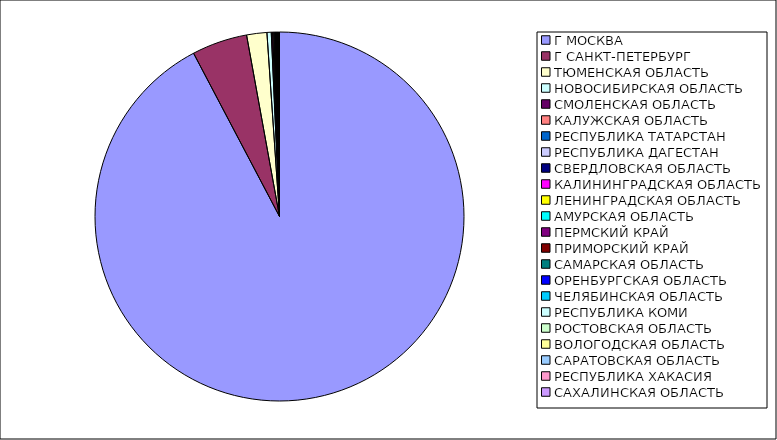
| Category | Оборот |
|---|---|
| Г МОСКВА | 0.922 |
| Г САНКТ-ПЕТЕРБУРГ | 0.049 |
| ТЮМЕНСКАЯ ОБЛАСТЬ | 0.018 |
| НОВОСИБИРСКАЯ ОБЛАСТЬ | 0.004 |
| СМОЛЕНСКАЯ ОБЛАСТЬ | 0.001 |
| КАЛУЖСКАЯ ОБЛАСТЬ | 0.001 |
| РЕСПУБЛИКА ТАТАРСТАН | 0.001 |
| РЕСПУБЛИКА ДАГЕСТАН | 0.001 |
| СВЕРДЛОВСКАЯ ОБЛАСТЬ | 0.001 |
| КАЛИНИНГРАДСКАЯ ОБЛАСТЬ | 0 |
| ЛЕНИНГРАДСКАЯ ОБЛАСТЬ | 0 |
| АМУРСКАЯ ОБЛАСТЬ | 0 |
| ПЕРМСКИЙ КРАЙ | 0 |
| ПРИМОРСКИЙ КРАЙ | 0 |
| САМАРСКАЯ ОБЛАСТЬ | 0 |
| ОРЕНБУРГСКАЯ ОБЛАСТЬ | 0 |
| ЧЕЛЯБИНСКАЯ ОБЛАСТЬ | 0 |
| РЕСПУБЛИКА КОМИ | 0 |
| РОСТОВСКАЯ ОБЛАСТЬ | 0 |
| ВОЛОГОДСКАЯ ОБЛАСТЬ | 0 |
| САРАТОВСКАЯ ОБЛАСТЬ | 0 |
| РЕСПУБЛИКА ХАКАСИЯ | 0 |
| САХАЛИНСКАЯ ОБЛАСТЬ | 0 |